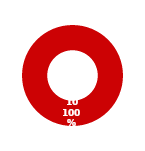
| Category | SA |
|---|---|
| MIL 3 Complete | 0 |
| MIL 3 Not Complete | 10 |